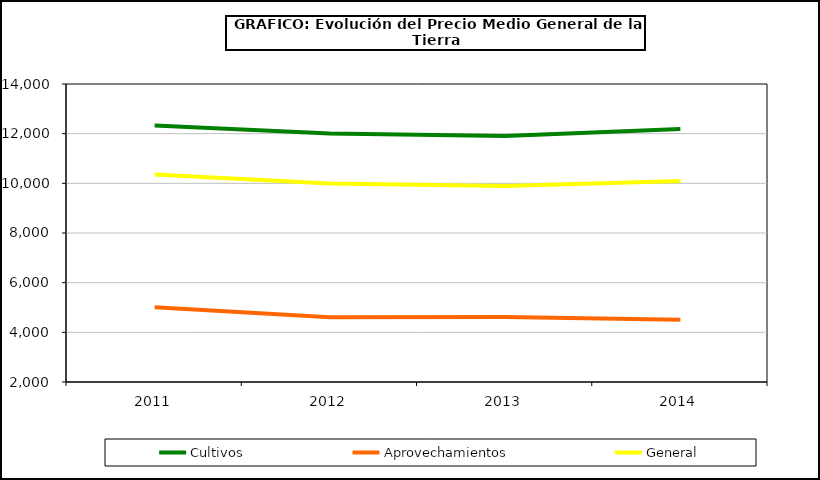
| Category | Cultivos | Aprovechamientos | General |
|---|---|---|---|
| 2011.0 | 12324.98 | 5014.285 | 10357.792 |
| 2012.0 | 12005.431 | 4606.026 | 9996.858 |
| 2013.0 | 11910.019 | 4616.112 | 9895.36 |
| 2014.0 | 12192.232 | 4501.776 | 10095.601 |